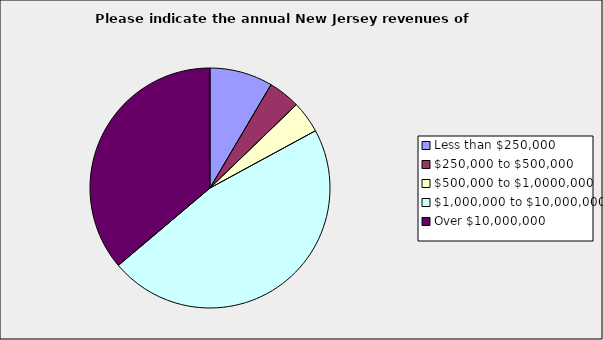
| Category | Series 0 |
|---|---|
| Less than $250,000 | 0.085 |
| $250,000 to $500,000 | 0.043 |
| $500,000 to $1,0000,000 | 0.043 |
| $1,000,000 to $10,000,000 | 0.468 |
| Over $10,000,000 | 0.362 |